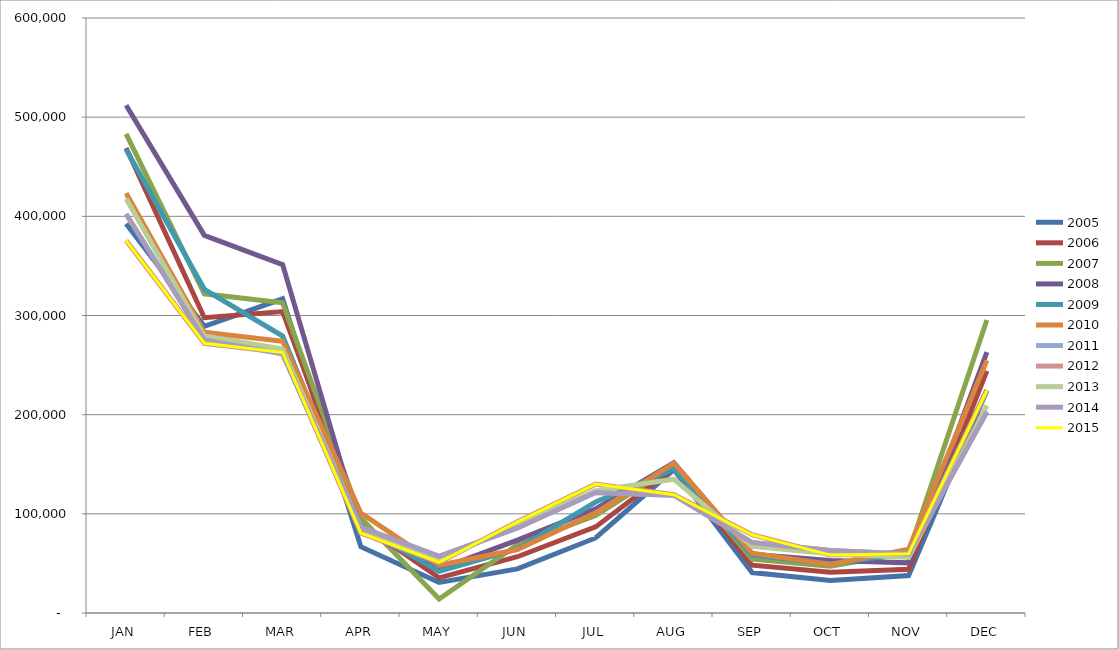
| Category | 2005 | 2006 | 2007 | 2008 | 2009 | 2010 | 2011 | 2012 | 2013 | 2014 | 2015 |
|---|---|---|---|---|---|---|---|---|---|---|---|
| JAN | 392461 | 468953 | 483069 | 512063 | 467348 | 423361 | 402406 | 375566 | 417790 | 402406 | 375566 |
| FEB | 289092 | 297746 | 321872 | 380833 | 326389 | 283067 | 275444 | 271989 | 279347 | 275444 | 271989 |
| MAR | 316867 | 304015 | 312794 | 351325 | 279345 | 273950 | 261287 | 262690 | 266106 | 261287 | 262690 |
| APR | 66806 | 90105 | 95750 | 83346 | 87328 | 100771 | 86360 | 80724 | 86265 | 86360 | 80724 |
| MAY | 30855 | 35473 | 14028 | 44179 | 41925 | 48102 | 57113 | 51014 | 52942 | 57113 | 51014 |
| JUN | 44522 | 56739 | 68761 | 73562 | 64684 | 64037 | 85798 | 91909 | 89152 | 85798 | 91909 |
| JUL | 75678 | 86849 | 98254 | 105006 | 111863 | 100999 | 121447 | 129954 | 123421 | 121447 | 129954 |
| AUG | 144706 | 146469 | 148382 | 151631 | 145223 | 151075 | 118857 | 119347 | 134905 | 118857 | 119347 |
| SEP | 40832 | 48201 | 54364 | 59218 | 58422 | 60316 | 71003 | 78925 | 67251 | 71003 | 78925 |
| OCT | 32757 | 40992 | 47118 | 52930 | 49446 | 49012 | 63130 | 58387 | 59747 | 63130 | 58387 |
| NOV | 37752 | 44123 | 60991 | 50554 | 60532 | 64272 | 59393 | 59740 | 55974 | 59393 | 59740 |
| DEC | 224417 | 244111 | 295496 | 263019 | 224760 | 254773 | 202976 | 224552 | 209163 | 202976 | 224552 |